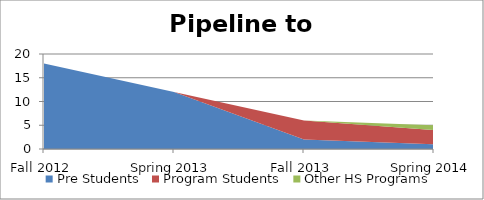
| Category | Pre Students | Program Students | Other HS Programs |
|---|---|---|---|
| Fall 2012 | 18 | 0 | 0 |
| Spring 2013 | 12 | 0 | 0 |
| Fall 2013 | 2 | 4 | 0 |
| Spring 2014 | 1 | 3 | 1 |